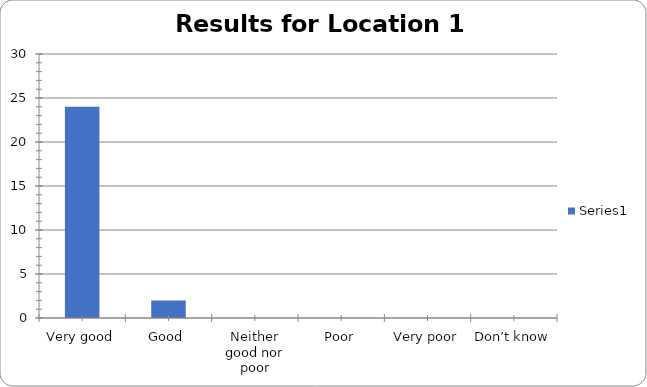
| Category | Series 0 |
|---|---|
| Very good | 24 |
| Good | 2 |
| Neither good nor poor | 0 |
| Poor | 0 |
| Very poor | 0 |
| Don’t know | 0 |